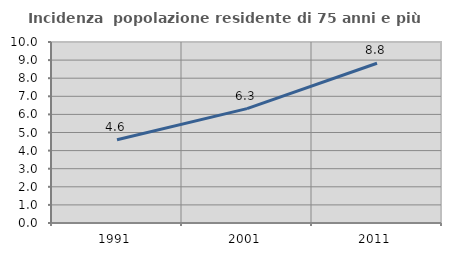
| Category | Incidenza  popolazione residente di 75 anni e più |
|---|---|
| 1991.0 | 4.6 |
| 2001.0 | 6.321 |
| 2011.0 | 8.827 |